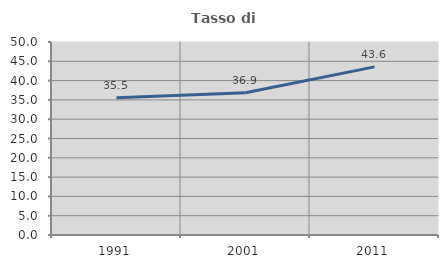
| Category | Tasso di occupazione   |
|---|---|
| 1991.0 | 35.526 |
| 2001.0 | 36.854 |
| 2011.0 | 43.55 |